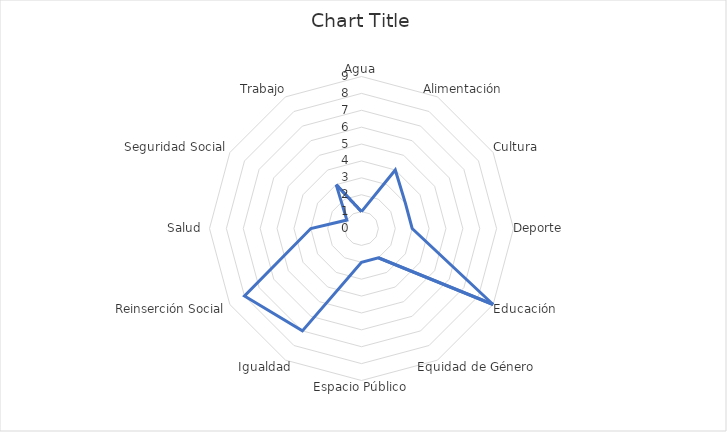
| Category | Series 0 |
|---|---|
| Agua | 1 |
| Alimentación | 4 |
| Cultura | 3 |
| Deporte | 3 |
| Educación | 9 |
| Equidad de Género | 2 |
| Espacio Público | 2 |
| Igualdad | 7 |
| Reinserción Social | 8 |
| Salud  | 3 |
| Seguridad Social | 1 |
| Trabajo  | 3 |